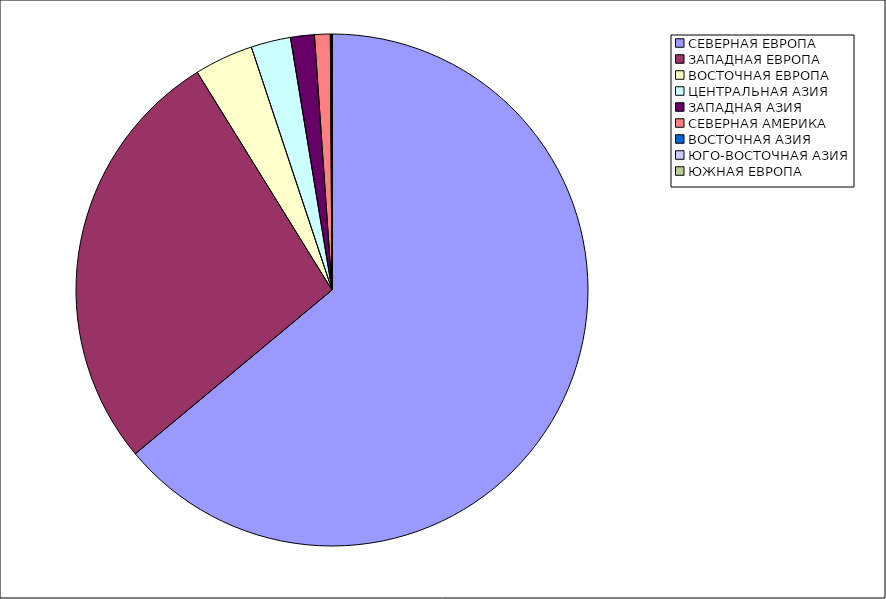
| Category | Оборот |
|---|---|
| СЕВЕРНАЯ ЕВРОПА | 63.947 |
| ЗАПАДНАЯ ЕВРОПА | 27.233 |
| ВОСТОЧНАЯ ЕВРОПА | 3.72 |
| ЦЕНТРАЛЬНАЯ АЗИЯ | 2.503 |
| ЗАПАДНАЯ АЗИЯ | 1.503 |
| СЕВЕРНАЯ АМЕРИКА | 0.992 |
| ВОСТОЧНАЯ АЗИЯ | 0.094 |
| ЮГО-ВОСТОЧНАЯ АЗИЯ | 0.009 |
| ЮЖНАЯ ЕВРОПА | 0 |